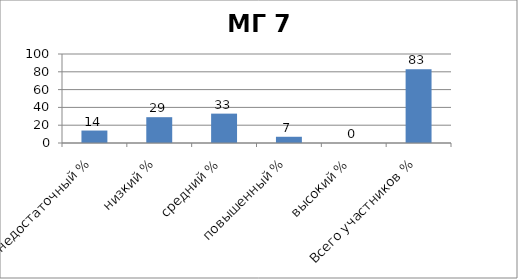
| Category | Series 0 |
|---|---|
| недостаточный % | 14 |
| низкий % | 29 |
| средний % | 33 |
| повышенный % | 7 |
| высокий % | 0 |
| Всего участников % | 83 |